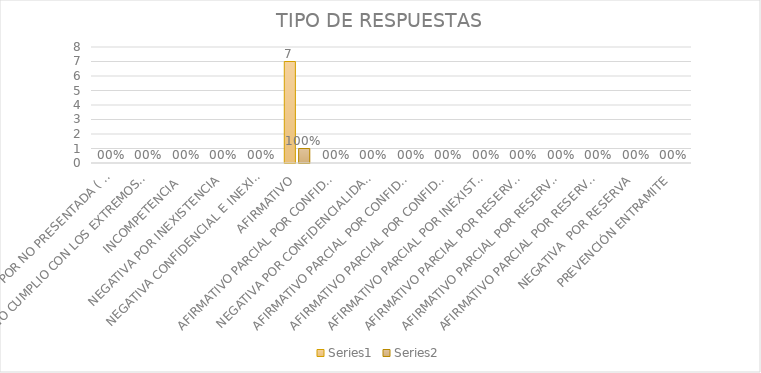
| Category | Series 4 | Series 5 |
|---|---|---|
| SE TIENE POR NO PRESENTADA ( NO CUMPLIÓ PREVENCIÓN) | 0 | 0 |
| NO CUMPLIO CON LOS EXTREMOS DEL ARTÍCULO 79 (REQUISITOS) | 0 | 0 |
| INCOMPETENCIA  | 0 | 0 |
| NEGATIVA POR INEXISTENCIA | 0 | 0 |
| NEGATIVA CONFIDENCIAL E INEXISTENTE | 0 | 0 |
| AFIRMATIVO | 7 | 1 |
| AFIRMATIVO PARCIAL POR CONFIDENCIALIDAD  | 0 | 0 |
| NEGATIVA POR CONFIDENCIALIDAD Y RESERVADA | 0 | 0 |
| AFIRMATIVO PARCIAL POR CONFIDENCIALIDAD E INEXISTENCIA | 0 | 0 |
| AFIRMATIVO PARCIAL POR CONFIDENCIALIDAD, RESERVA E INEXISTENCIA | 0 | 0 |
| AFIRMATIVO PARCIAL POR INEXISTENCIA | 0 | 0 |
| AFIRMATIVO PARCIAL POR RESERVA | 0 | 0 |
| AFIRMATIVO PARCIAL POR RESERVA Y CONFIDENCIALIDAD | 0 | 0 |
| AFIRMATIVO PARCIAL POR RESERVA E INEXISTENCIA | 0 | 0 |
| NEGATIVA  POR RESERVA | 0 | 0 |
| PREVENCIÓN ENTRAMITE | 0 | 0 |